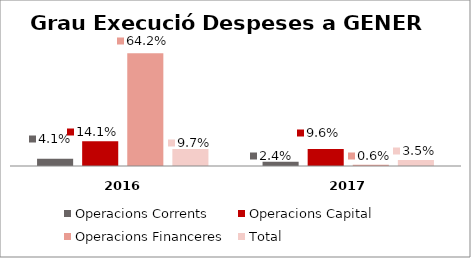
| Category | Operacions Corrents | Operacions Capital | Operacions Financeres | Total |
|---|---|---|---|---|
| 0 | 0.041 | 0.141 | 0.642 | 0.097 |
| 1 | 0.024 | 0.096 | 0.006 | 0.035 |